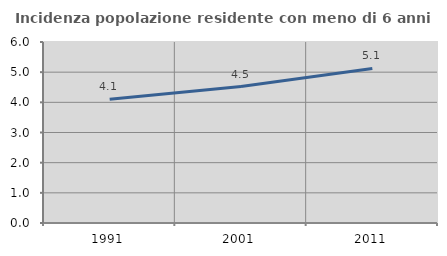
| Category | Incidenza popolazione residente con meno di 6 anni |
|---|---|
| 1991.0 | 4.098 |
| 2001.0 | 4.524 |
| 2011.0 | 5.122 |